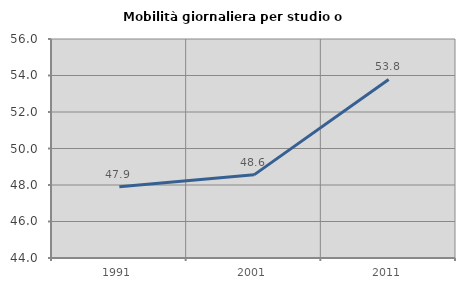
| Category | Mobilità giornaliera per studio o lavoro |
|---|---|
| 1991.0 | 47.904 |
| 2001.0 | 48.555 |
| 2011.0 | 53.784 |